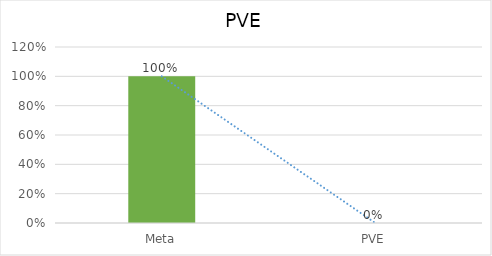
| Category | Series 0 |
|---|---|
| Meta | 1 |
| PVE | 0 |